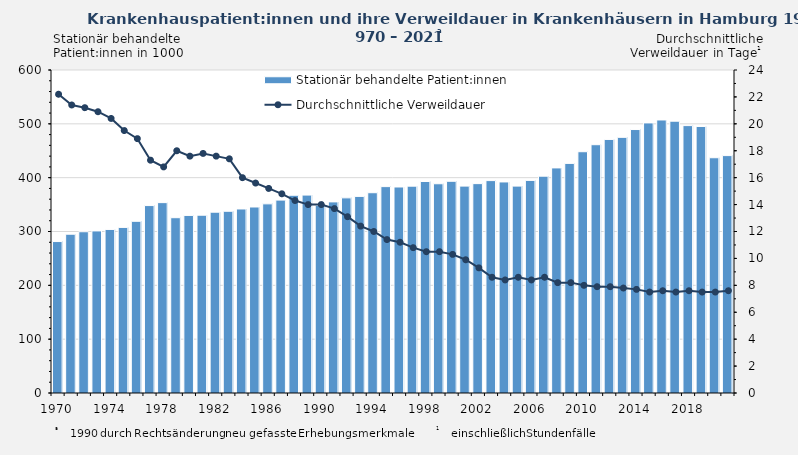
| Category | Stationär behandelte Patient:innen |
|---|---|
| 1970.0 | 281.312 |
| 1971.0 | 294.952 |
| 1972.0 | 299.555 |
| 1973.0 | 301.055 |
| 1974.0 | 303.829 |
| 1975.0 | 307.63 |
| 1976.0 | 318.934 |
| 1977.0 | 348.175 |
| 1978.0 | 353.637 |
| 1979.0 | 325.626 |
| 1980.0 | 329.893 |
| 1981.0 | 330.246 |
| 1982.0 | 335.871 |
| 1983.0 | 337.57 |
| 1984.0 | 341.85 |
| 1985.0 | 345.524 |
| 1986.0 | 351.37 |
| 1987.0 | 358.339 |
| 1988.0 | 367.336 |
| 1989.0 | 367.653 |
| 1990.0 | 348.744 |
| 1991.0 | 354.995 |
| 1992.0 | 362.481 |
| 1993.0 | 365.226 |
| 1994.0 | 372.023 |
| 1995.0 | 383.376 |
| 1996.0 | 382.688 |
| 1997.0 | 384.208 |
| 1998.0 | 392.887 |
| 1999.0 | 388.698 |
| 2000.0 | 393.274 |
| 2001.0 | 384.306 |
| 2002.0 | 388.926 |
| 2003.0 | 394.554 |
| 2004.0 | 392.057 |
| 2005.0 | 384.3 |
| 2006.0 | 394.933 |
| 2007.0 | 402.754 |
| 2008.0 | 418.109 |
| 2009.0 | 426.547 |
| 2010.0 | 448.176 |
| 2011.0 | 461.221 |
| 2012.0 | 471.009 |
| 2013.0 | 474.898 |
| 2014.0 | 489.391 |
| 2015.0 | 501.704 |
| 2016.0 | 507.159 |
| 2017.0 | 504.888 |
| 2018.0 | 496.708 |
| 2019.0 | 495.099 |
| 2020.0 | 437 |
| 2021.0 | 441 |